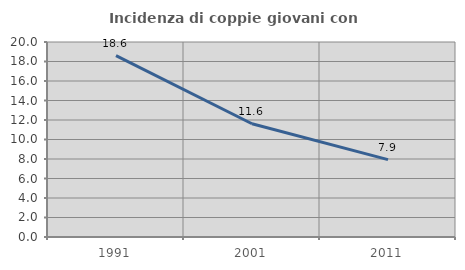
| Category | Incidenza di coppie giovani con figli |
|---|---|
| 1991.0 | 18.61 |
| 2001.0 | 11.618 |
| 2011.0 | 7.94 |